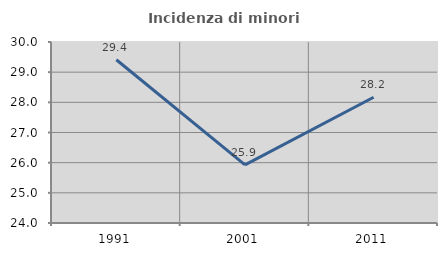
| Category | Incidenza di minori stranieri |
|---|---|
| 1991.0 | 29.412 |
| 2001.0 | 25.926 |
| 2011.0 | 28.169 |